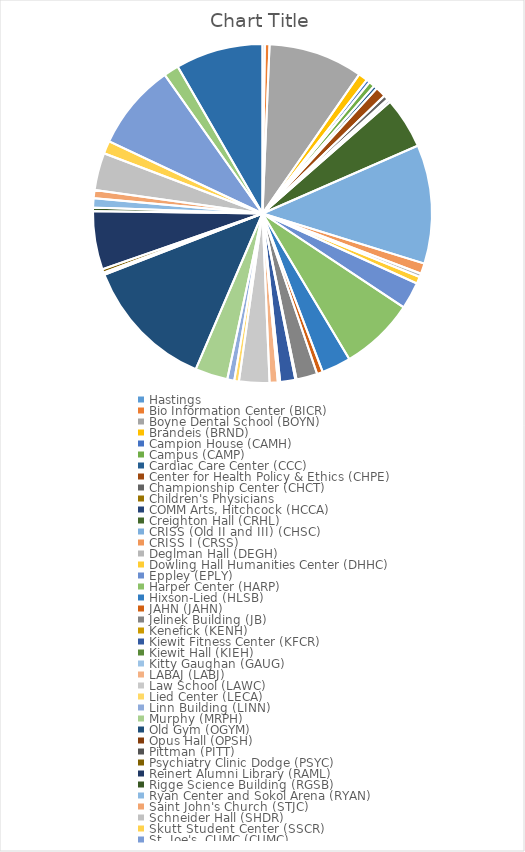
| Category | Series 0 |
|---|---|
| Hastings  | 2 |
| Bio Information Center (BICR)  | 4 |
| Boyne Dental School (BOYN)  | 81 |
| Brandeis (BRND)  | 8 |
| Campion House (CAMH)  | 3 |
| Campus (CAMP)  | 5 |
| Cardiac Care Center (CCC)  | 3 |
| Center for Health Policy & Ethics (CHPE)  | 9 |
| Championship Center (CHCT)  | 4 |
| Children's Physicians  | 1 |
| COMM Arts, Hitchcock (HCCA)  | 2 |
| Creighton Hall (CRHL)  | 44 |
| CRISS (Old II and III) (CHSC)  | 102 |
| CRISS I (CRSS)  | 9 |
| Deglman Hall (DEGH)  | 3 |
| Dowling Hall Humanities Center (DHHC)  | 6 |
| Eppley (EPLY)  | 23 |
| Harper Center (HARP)  | 64 |
| Hixson-Lied (HLSB)  | 25 |
| JAHN (JAHN)  | 5 |
| Jelinek Building (JB)  | 18 |
| Kenefick (KENH)  | 1 |
| Kiewit Fitness Center (KFCR)  | 13 |
| Kiewit Hall (KIEH)  | 1 |
| Kitty Gaughan (GAUG)  | 1 |
| LABAJ (LABJ)  | 7 |
| Law School (LAWC)  | 26 |
| Lied Center (LECA)  | 4 |
| Linn Building (LINN)  | 6 |
| Murphy (MRPH)  | 28 |
| Old Gym (OGYM)  | 114 |
| Opus Hall (OPSH)  | 1 |
| Pittman (PITT)  | 1 |
| Psychiatry Clinic Dodge (PSYC)  | 3 |
| Reinert Alumni Library (RAML)  | 50 |
| Rigge Science Building (RGSB)  | 3 |
| Ryan Center and Sokol Arena (RYAN)  | 8 |
| Saint John's Church (STJC)  | 7 |
| Schneider Hall (SHDR)  | 32 |
| Skutt Student Center (SSCR)  | 11 |
| St. Joe's, CUMC (CUMC)  | 74 |
| Swanson Hall (SWAH)  | 13 |
| Wareham Building (WARE)  | 75 |